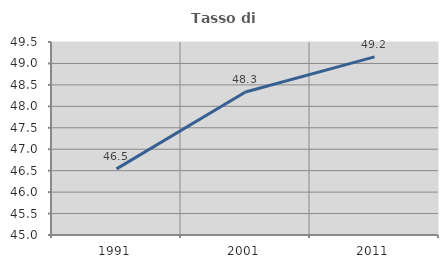
| Category | Tasso di occupazione   |
|---|---|
| 1991.0 | 46.542 |
| 2001.0 | 48.335 |
| 2011.0 | 49.154 |